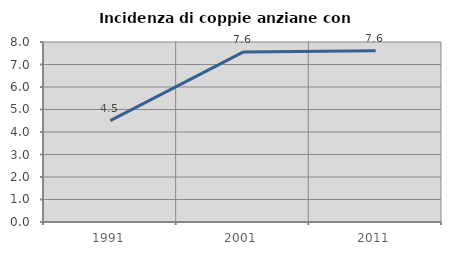
| Category | Incidenza di coppie anziane con figli |
|---|---|
| 1991.0 | 4.507 |
| 2001.0 | 7.553 |
| 2011.0 | 7.609 |